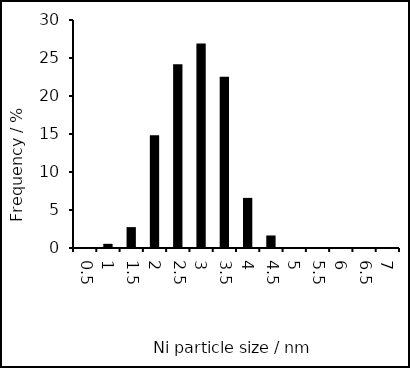
| Category | Series 0 |
|---|---|
| 0.5 | 0 |
| 1.0 | 0.549 |
| 1.5 | 2.747 |
| 2.0 | 14.835 |
| 2.5 | 24.176 |
| 3.0 | 26.923 |
| 3.5 | 22.527 |
| 4.0 | 6.593 |
| 4.5 | 1.648 |
| 5.0 | 0 |
| 5.5 | 0 |
| 6.0 | 0 |
| 6.5 | 0 |
| 7.0 | 0 |